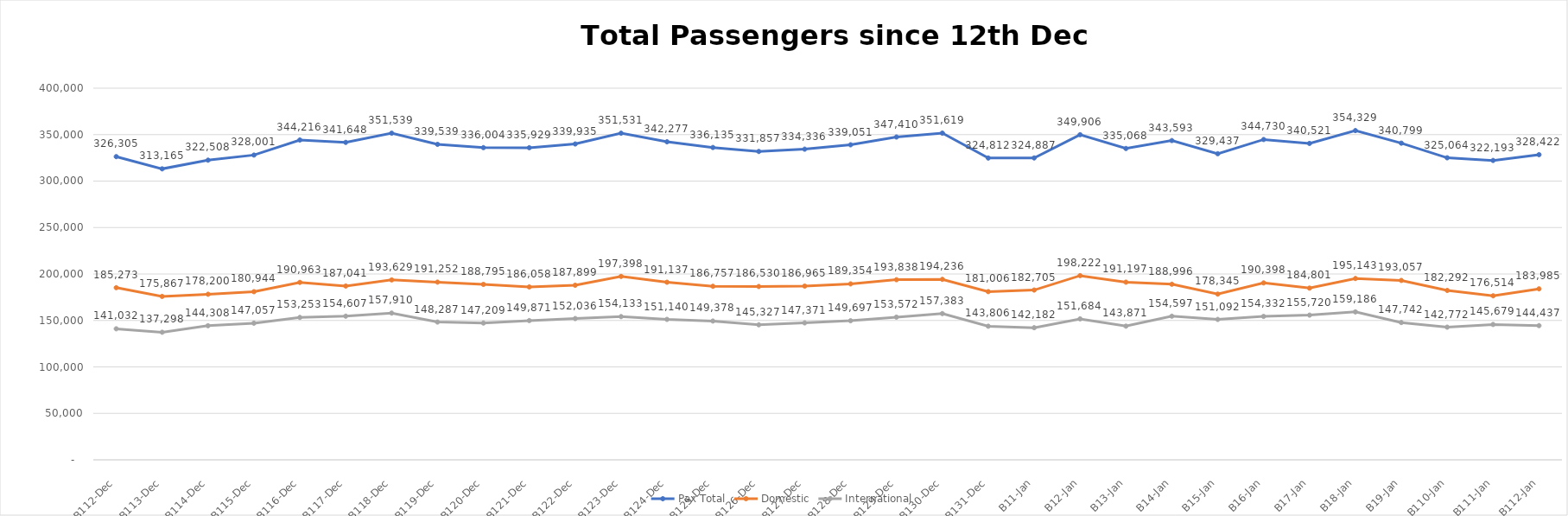
| Category | Pax Total |  Domestic  |  International  |
|---|---|---|---|
| 2022-12-12 | 326305 | 185273 | 141032 |
| 2022-12-13 | 313165 | 175867 | 137298 |
| 2022-12-14 | 322508 | 178200 | 144308 |
| 2022-12-15 | 328001 | 180944 | 147057 |
| 2022-12-16 | 344216 | 190963 | 153253 |
| 2022-12-17 | 341648 | 187041 | 154607 |
| 2022-12-18 | 351539 | 193629 | 157910 |
| 2022-12-19 | 339539 | 191252 | 148287 |
| 2022-12-20 | 336004 | 188795 | 147209 |
| 2022-12-21 | 335929 | 186058 | 149871 |
| 2022-12-22 | 339935 | 187899 | 152036 |
| 2022-12-23 | 351531 | 197398 | 154133 |
| 2022-12-24 | 342277 | 191137 | 151140 |
| 2022-12-25 | 336135 | 186757 | 149378 |
| 2022-12-26 | 331857 | 186530 | 145327 |
| 2022-12-27 | 334336 | 186965 | 147371 |
| 2022-12-28 | 339051 | 189354 | 149697 |
| 2022-12-29 | 347410 | 193838 | 153572 |
| 2022-12-30 | 351619 | 194236 | 157383 |
| 2022-12-31 | 324812 | 181006 | 143806 |
| 2023-01-01 | 324887 | 182705 | 142182 |
| 2023-01-02 | 349906 | 198222 | 151684 |
| 2023-01-03 | 335068 | 191197 | 143871 |
| 2023-01-04 | 343593 | 188996 | 154597 |
| 2023-01-05 | 329437 | 178345 | 151092 |
| 2023-01-06 | 344730 | 190398 | 154332 |
| 2023-01-07 | 340521 | 184801 | 155720 |
| 2023-01-08 | 354329 | 195143 | 159186 |
| 2023-01-09 | 340799 | 193057 | 147742 |
| 2023-01-10 | 325064 | 182292 | 142772 |
| 2023-01-11 | 322193 | 176514 | 145679 |
| 2023-01-12 | 328422 | 183985 | 144437 |